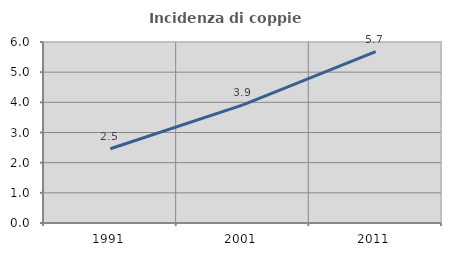
| Category | Incidenza di coppie miste |
|---|---|
| 1991.0 | 2.462 |
| 2001.0 | 3.915 |
| 2011.0 | 5.679 |